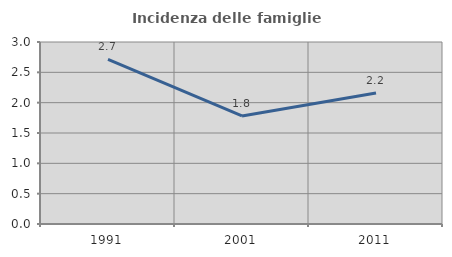
| Category | Incidenza delle famiglie numerose |
|---|---|
| 1991.0 | 2.713 |
| 2001.0 | 1.781 |
| 2011.0 | 2.16 |